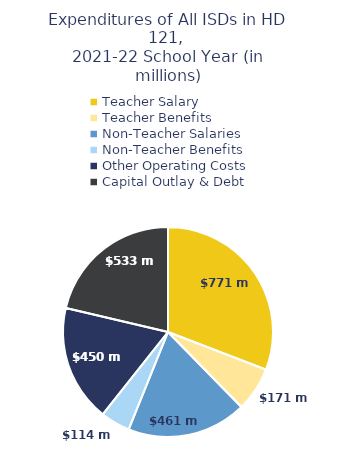
| Category | Series 0 |
|---|---|
| Teacher Salary | 771054351 |
| Teacher Benefits | 170945827 |
| Non-Teacher Salaries | 460851766 |
| Non-Teacher Benefits | 114090132 |
| Other Operating Costs | 450070831 |
| Capital Outlay & Debt | 533319101 |